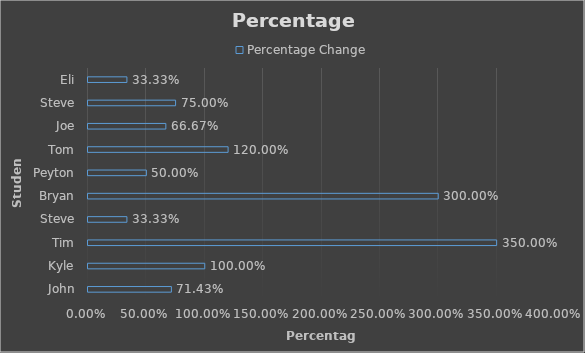
| Category | Percentage Change |
|---|---|
| John | 0.714 |
| Kyle | 1 |
| Tim | 3.5 |
| Steve | 0.333 |
| Bryan | 3 |
| Peyton | 0.5 |
| Tom | 1.2 |
| Joe | 0.667 |
| Steve | 0.75 |
| Eli | 0.333 |